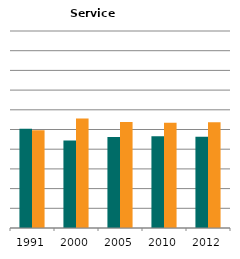
| Category | Male | Female |
|---|---|---|
| 1991.0 | 0.503 | 0.497 |
| 2000.0 | 0.444 | 0.556 |
| 2005.0 | 0.462 | 0.538 |
| 2010.0 | 0.466 | 0.534 |
| 2012.0 | 0.463 | 0.537 |